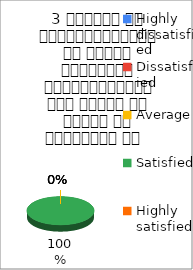
| Category | 3 शिक्षक का विद्यार्थियों के प्रति व्यव्हार मित्रतापूर्ण एवं सहयोग के भावना से परिपूर्ण था   |
|---|---|
| Highly dissatisfied | 0 |
| Dissatisfied | 0 |
| Average | 0 |
| Satisfied | 1 |
| Highly satisfied | 0 |